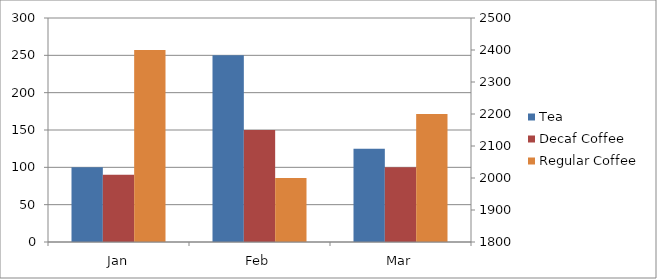
| Category | Tea | Decaf Coffee | Prim Axis Pad Right |
|---|---|---|---|
| Jan | 100 | 90 |  |
| Feb | 250 | 150 |  |
| Mar | 125 | 100 |  |